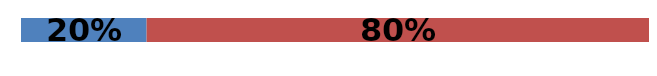
| Category | Series 0 | Series 1 | Series 2 |
|---|---|---|---|
| 0 | 0.2 | 0.8 | 0 |